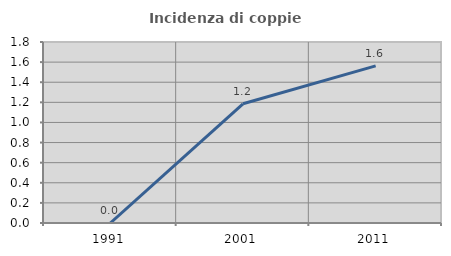
| Category | Incidenza di coppie miste |
|---|---|
| 1991.0 | 0 |
| 2001.0 | 1.186 |
| 2011.0 | 1.562 |